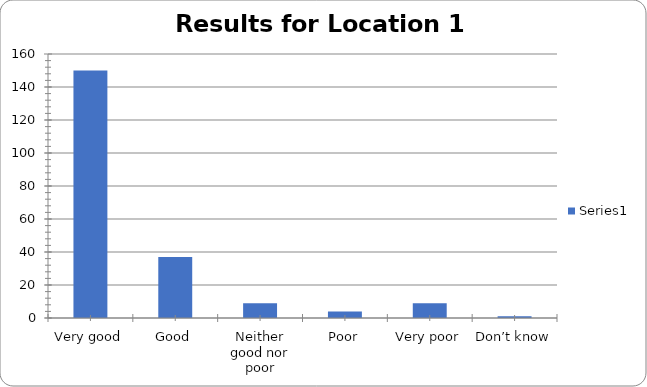
| Category | Series 0 |
|---|---|
| Very good | 150 |
| Good | 37 |
| Neither good nor poor | 9 |
| Poor | 4 |
| Very poor | 9 |
| Don’t know | 1 |